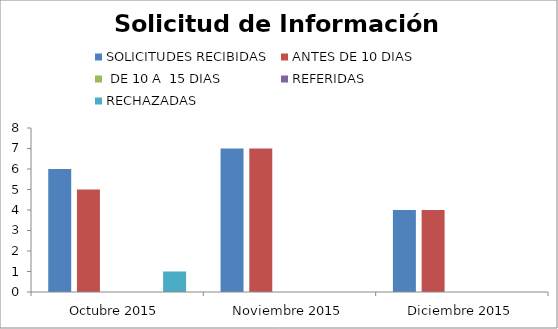
| Category | SOLICITUDES RECIBIDAS | ANTES DE 10 DIAS |  DE 10 A  15 DIAS  | REFERIDAS | RECHAZADAS |
|---|---|---|---|---|---|
| Octubre 2015 | 6 | 5 | 0 | 0 | 1 |
| Noviembre 2015 | 7 | 7 | 0 | 0 | 0 |
| Diciembre 2015 | 4 | 4 | 0 | 0 | 0 |